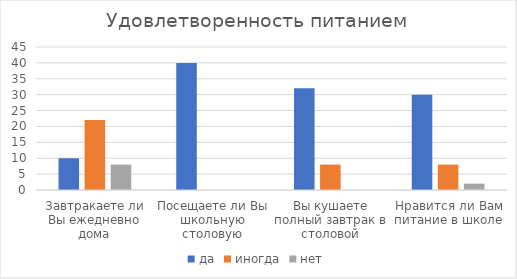
| Category | да | иногда | нет |
|---|---|---|---|
| Завтракаете ли Вы ежедневно дома | 10 | 22 | 8 |
| Посещаете ли Вы школьную столовую | 40 | 0 | 0 |
| Вы кушаете полный завтрак в столовой | 32 | 8 | 0 |
| Нравится ли Вам питание в школе | 30 | 8 | 2 |